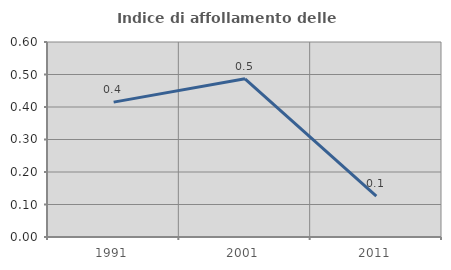
| Category | Indice di affollamento delle abitazioni  |
|---|---|
| 1991.0 | 0.415 |
| 2001.0 | 0.487 |
| 2011.0 | 0.125 |